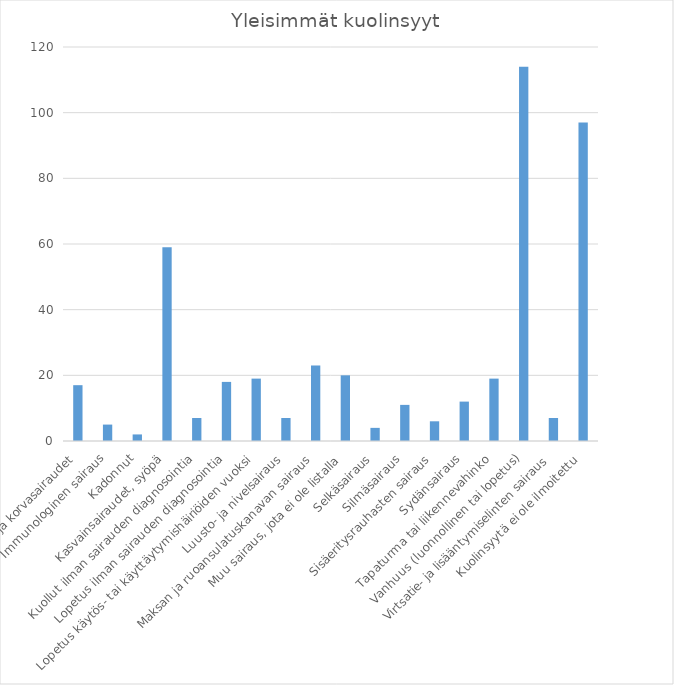
| Category | 5 |
|---|---|
| Iho- ja korvasairaudet | 17 |
| Immunologinen sairaus | 5 |
| Kadonnut | 2 |
| Kasvainsairaudet, syöpä | 59 |
| Kuollut ilman sairauden diagnosointia | 7 |
| Lopetus ilman sairauden diagnosointia | 18 |
| Lopetus käytös- tai käyttäytymishäiriöiden vuoksi | 19 |
| Luusto- ja nivelsairaus | 7 |
| Maksan ja ruoansulatuskanavan sairaus | 23 |
| Muu sairaus, jota ei ole listalla | 20 |
| Selkäsairaus | 4 |
| Silmäsairaus | 11 |
| Sisäeritysrauhasten sairaus | 6 |
| Sydänsairaus | 12 |
| Tapaturma tai liikennevahinko | 19 |
| Vanhuus (luonnollinen tai lopetus) | 114 |
| Virtsatie- ja lisääntymiselinten sairaus | 7 |
| Kuolinsyytä ei ole ilmoitettu | 97 |